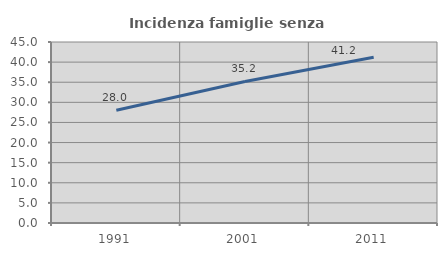
| Category | Incidenza famiglie senza nuclei |
|---|---|
| 1991.0 | 28.042 |
| 2001.0 | 35.182 |
| 2011.0 | 41.189 |